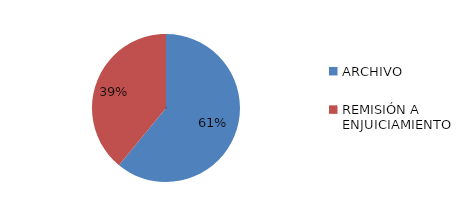
| Category | Series 0 |
|---|---|
| ARCHIVO | 114 |
| REMISIÓN A ENJUICIAMIENTO | 73 |